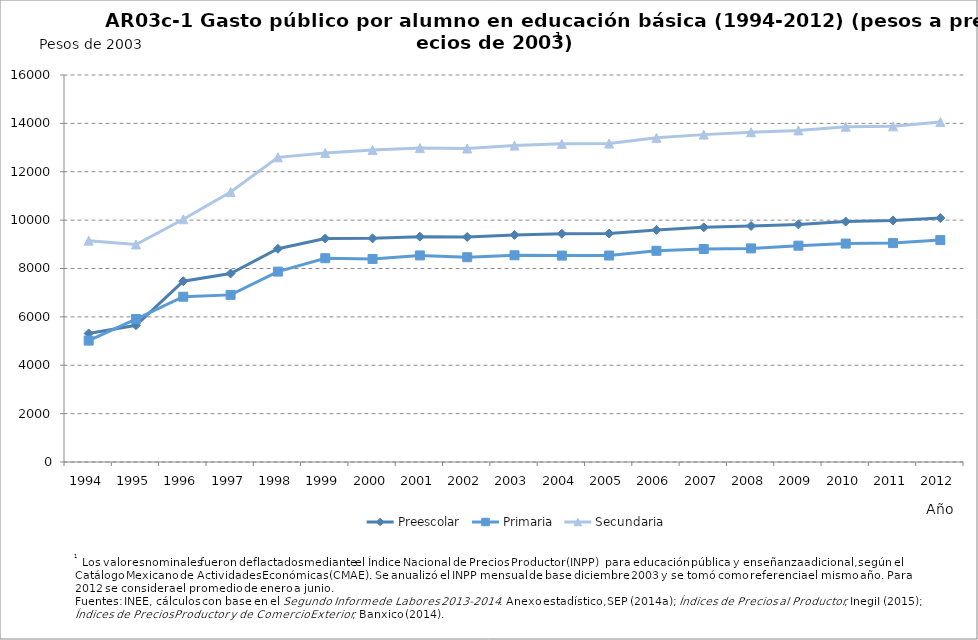
| Category | Preescolar | Primaria | Secundaria |
|---|---|---|---|
| 1994.0 | 5314.17 | 5018.938 | 9152.182 |
| 1995.0 | 5653.432 | 5910.406 | 8994.096 |
| 1996.0 | 7474.06 | 6833.426 | 10036.595 |
| 1997.0 | 7794.994 | 6909.199 | 11161.014 |
| 1998.0 | 8816.395 | 7871.781 | 12594.85 |
| 1999.0 | 9239.924 | 8424.636 | 12772.836 |
| 2000.0 | 9246.995 | 8395.298 | 12897.125 |
| 2001.0 | 9316.767 | 8540.369 | 12976.925 |
| 2002.0 | 9303.072 | 8466.841 | 12961.583 |
| 2003.0 | 9390 | 8546 | 13082 |
| 2004.0 | 9437.757 | 8534.142 | 13152.619 |
| 2005.0 | 9444.463 | 8536.341 | 13167.761 |
| 2006.0 | 9596.706 | 8732.138 | 13400.806 |
| 2007.0 | 9702.756 | 8805.862 | 13534.937 |
| 2008.0 | 9760.174 | 8830.633 | 13633.258 |
| 2009.0 | 9824.036 | 8944.272 | 13709.663 |
| 2010.0 | 9940.529 | 9030.481 | 13860.738 |
| 2011.0 | 9988.336 | 9049.835 | 13876.413 |
| 2012.0 | 10085.291 | 9174.361 | 14054.341 |